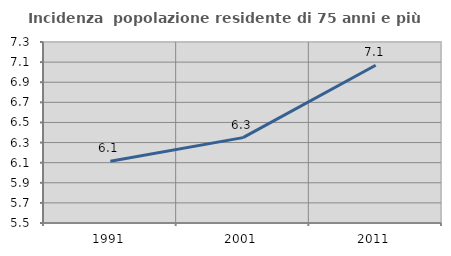
| Category | Incidenza  popolazione residente di 75 anni e più |
|---|---|
| 1991.0 | 6.115 |
| 2001.0 | 6.349 |
| 2011.0 | 7.069 |